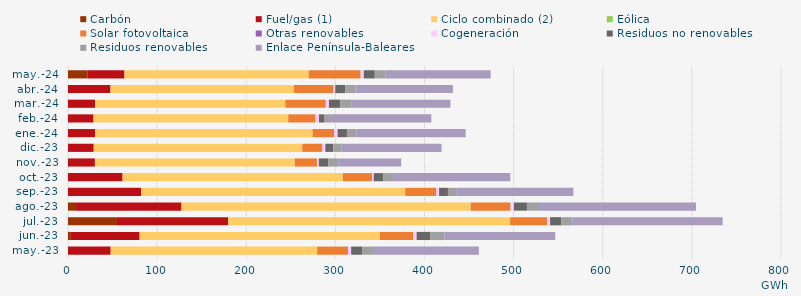
| Category | Carbón | Fuel/gas (1) | Ciclo combinado (2) | Eólica | Solar fotovoltaica | Otras renovables | Cogeneración | Residuos no renovables | Residuos renovables | Enlace Península-Baleares |
|---|---|---|---|---|---|---|---|---|---|---|
| may.-23 | -0.833 | 47.925 | 231.475 | 0.25 | 34.459 | 0.144 | 3.463 | 12.229 | 12.229 | 118.762 |
| jun.-23 | 3.18 | 77.204 | 269.55 | 0.056 | 37.286 | 0.14 | 3.733 | 15.598 | 15.598 | 124.35 |
| jul.-23 | 54.925 | 124.683 | 316.355 | 0.119 | 41.537 | 0.102 | 3.18 | 12.541 | 12.541 | 168.548 |
| ago.-23 | 9.023 | 118.34 | 324.377 | 0.098 | 44.65 | 0.092 | 3.675 | 14.683 | 14.683 | 175.009 |
| sep.-23 | -0.823 | 82.054 | 296.323 | 0 | 34.851 | 0.141 | 2.995 | 9.934 | 9.934 | 130.855 |
| oct.-23 | -0.827 | 61.254 | 247.113 | 0.01 | 32.896 | 0.148 | 1.621 | 10.861 | 10.861 | 131.447 |
| nov.-23 | -0.895 | 30.185 | 224.261 | 0.009 | 24.885 | 0.144 | 1.997 | 10.81 | 10.81 | 70.736 |
| dic.-23 | -0.696 | 28.871 | 233.915 | 0 | 22.637 | 0.126 | 3.157 | 8.992 | 8.992 | 112.44 |
| ene.-24 | -0.706 | 30.444 | 244.02 | 0 | 23.97 | 0.104 | 3.937 | 10.485 | 10.485 | 122.76 |
| feb.-24 | -0.663 | 28.622 | 218.491 | 0 | 30.744 | 0.04 | 3.74 | 5.609 | 5.609 | 114.744 |
| mar.-24 | -0.71 | 30.374 | 213.549 | 0 | 45.305 | 0.04 | 3.485 | 12.829 | 12.829 | 110.668 |
| abr.-24 | -0.939 | 47.711 | 205.682 | 0 | 44.568 | 0.016 | 1.91 | 11.323 | 11.323 | 109.362 |
| may.-24 | 22.074 | 41.292 | 206.763 | 0 | 58.204 | 0.041 | 3.54 | 12.275 | 12.275 | 117.765 |